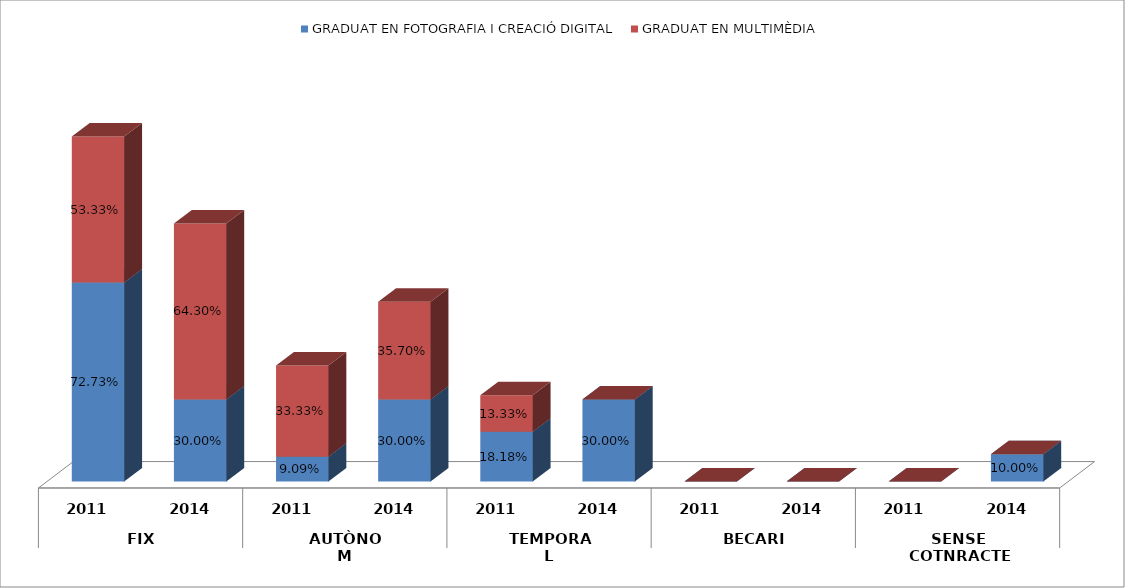
| Category | GRADUAT EN FOTOGRAFIA I CREACIÓ DIGITAL | GRADUAT EN MULTIMÈDIA |
|---|---|---|
| 0 | 0.727 | 0.533 |
| 1 | 0.3 | 0.643 |
| 2 | 0.091 | 0.333 |
| 3 | 0.3 | 0.357 |
| 4 | 0.182 | 0.133 |
| 5 | 0.3 | 0 |
| 6 | 0 | 0 |
| 7 | 0 | 0 |
| 8 | 0 | 0 |
| 9 | 0.1 | 0 |